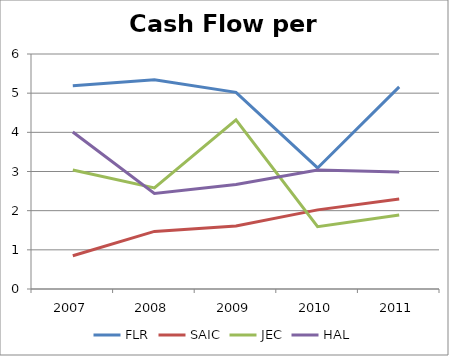
| Category | FLR | SAIC | JEC | HAL |
|---|---|---|---|---|
| 2007.0 | 5.19 | 0.85 | 3.04 | 4.01 |
| 2008.0 | 5.34 | 1.47 | 2.58 | 2.44 |
| 2009.0 | 5.02 | 1.61 | 4.32 | 2.67 |
| 2010.0 | 3.09 | 2.02 | 1.59 | 3.04 |
| 2011.0 | 5.16 | 2.3 | 1.89 | 2.99 |